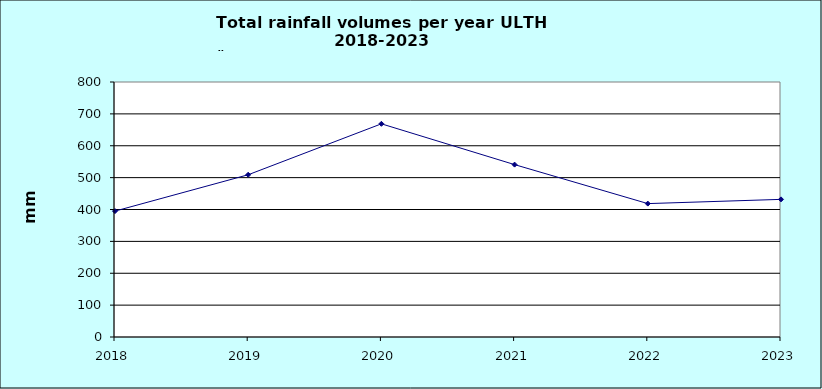
| Category | Series 0 |
|---|---|
| 2018.0 | 395 |
| 2019.0 | 509 |
| 2020.0 | 668.8 |
| 2021.0 | 540.8 |
| 2022.0 | 418.5 |
| 2023.0 | 431.8 |